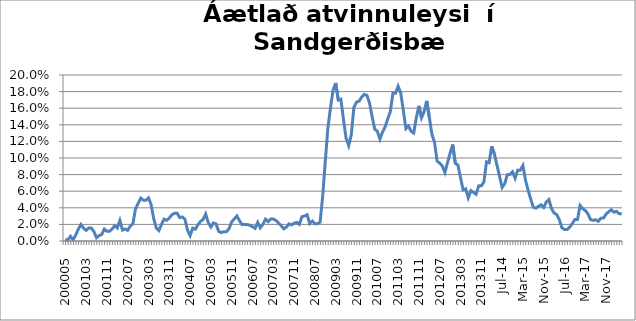
| Category | Series 0 |
|---|---|
| 200005 | 0.001 |
| 200006 | 0.001 |
| 200007 | 0.006 |
| 200010 | 0.001 |
| 200011 | 0.007 |
| 200012 | 0.014 |
| 200101 | 0.02 |
| 200102 | 0.016 |
| 200103 | 0.013 |
| 200104 | 0.016 |
| 200105 | 0.016 |
| 200106 | 0.011 |
| 200107 | 0.004 |
| 200108 | 0.007 |
| 200109 | 0.008 |
| 200110 | 0.014 |
| 200111 | 0.012 |
| 200112 | 0.012 |
| 200201 | 0.014 |
| 200202 | 0.018 |
| 200203 | 0.016 |
| 200204 | 0.025 |
| 200205 | 0.013 |
| 200206 | 0.014 |
| 200207 | 0.013 |
| 200208 | 0.018 |
| 200209 | 0.021 |
| 200210 | 0.039 |
| 200211 | 0.045 |
| 200212 | 0.052 |
| 200301 | 0.049 |
| 200302 | 0.049 |
| 200303 | 0.052 |
| 200304 | 0.044 |
| 200305 | 0.027 |
| 200306 | 0.015 |
| 200307 | 0.013 |
| 200308 | 0.02 |
| 200309 | 0.026 |
| 200310 | 0.025 |
| 200311 | 0.028 |
| 200312 | 0.032 |
| 200401 | 0.034 |
| 200402 | 0.034 |
| 200403 | 0.028 |
| 200404 | 0.029 |
| 200405 | 0.026 |
| 200406 | 0.013 |
| 200407 | 0.006 |
| 200408 | 0.015 |
| 200409 | 0.014 |
| 200410 | 0.02 |
| 200411 | 0.023 |
| 200412 | 0.026 |
| 200501 | 0.032 |
| 200502 | 0.022 |
| 200503 | 0.017 |
| 200504 | 0.022 |
| 200505 | 0.021 |
| 200506 | 0.012 |
| 200507 | 0.01 |
| 200508 | 0.011 |
| 200509 | 0.011 |
| 200510 | 0.015 |
| 200511 | 0.023 |
| 200512 | 0.027 |
| 200601 | 0.03 |
| 200602 | 0.024 |
| 200603 | 0.02 |
| 200604 | 0.02 |
| 200605 | 0.02 |
| 200606 | 0.019 |
| 200607 | 0.017 |
| 200608 | 0.015 |
| 200609 | 0.022 |
| 200610 | 0.016 |
| 200611 | 0.02 |
| 200612 | 0.026 |
| 200701 | 0.023 |
| 200702 | 0.027 |
| 200703 | 0.027 |
| 200704 | 0.025 |
| 200705 | 0.022 |
| 200706 | 0.019 |
| 200707 | 0.015 |
| 200708 | 0.017 |
| 200709 | 0.021 |
| 200710 | 0.019 |
| 200711 | 0.021 |
| 200712 | 0.022 |
| 200801 | 0.02 |
| 200802 | 0.029 |
| 200803 | 0.03 |
| 200804 | 0.032 |
| 200805 | 0.021 |
| 200806 | 0.024 |
| 200807 | 0.021 |
| 200808 | 0.021 |
| 200809 | 0.023 |
| 200810 | 0.054 |
| 200811 | 0.096 |
| 200812 | 0.136 |
| 200901 | 0.161 |
| 200902 | 0.182 |
| 200903 | 0.19 |
| 200904 | 0.17 |
| 200905 | 0.171 |
| 200906 | 0.146 |
| 200907 | 0.124 |
| 200908 | 0.115 |
| 200909 | 0.128 |
| 200910 | 0.161 |
| 200911 | 0.167 |
| 200912 | 0.168 |
| 201001 | 0.173 |
| 201002 | 0.177 |
| 201003 | 0.176 |
| 201004 | 0.166 |
| 201005 | 0.15 |
| 201006 | 0.135 |
| 201007 | 0.132 |
| 201008 | 0.123 |
| 201009 | 0.131 |
| 201010 | 0.138 |
| 201011 | 0.147 |
| 201012 | 0.156 |
| 201101 | 0.178 |
| 201102 | 0.178 |
| 201103 | 0.187 |
| 201104 | 0.179 |
| 201105 | 0.158 |
| 201106 | 0.136 |
| 201107 | 0.139 |
| 201108 | 0.132 |
| 201109 | 0.13 |
| 201110 | 0.148 |
| 201111 | 0.163 |
| 201112 | 0.148 |
| 201201 | 0.156 |
| 201202 | 0.169 |
| 201203 | 0.149 |
| 201204 | 0.129 |
| 201205 | 0.119 |
| 201206 | 0.096 |
| 201207 | 0.094 |
| 201208 | 0.09 |
| 201209 | 0.083 |
| 201210 | 0.094 |
| 201211 | 0.106 |
| 201212 | 0.116 |
| 201301 | 0.094 |
| 201302 | 0.091 |
| 201303 | 0.077 |
| 201304 | 0.062 |
| 201305 | 0.063 |
| 201306 | 0.052 |
| 201307 | 0.061 |
| 201308 | 0.058 |
| 201309 | 0.056 |
| 201310 | 0.067 |
| 201311 | 0.067 |
| 201312 | 0.071 |
| jan.14 | 0.095 |
| feb.14 | 0.094 |
| mar.14 | 0.114 |
| apr.14 | 0.105 |
| maí.14 | 0.092 |
| jún.14 | 0.078 |
| júl.14 | 0.065 |
| ágú.14 | 0.069 |
| sep.14 | 0.08 |
| okt.14 | 0.08 |
| nóv.14 | 0.083 |
| des.14 | 0.076 |
| jan.15 | 0.085 |
| feb.15 | 0.085 |
| mar.15 | 0.091 |
| apr.15 | 0.073 |
| maí.15 | 0.061 |
| jún.15 | 0.051 |
| júl.15 | 0.041 |
| ágú.15 | 0.04 |
| sep.15 | 0.042 |
| okt.15 | 0.044 |
| nóv.15 | 0.04 |
| des.15 | 0.047 |
| jan.16 | 0.05 |
| feb.16 | 0.039 |
| mar.16 | 0.034 |
| apr.16 | 0.032 |
| maí.16 | 0.026 |
| jún.16 | 0.016 |
| júl.16 | 0.014 |
| ágú.16 | 0.014 |
| sep.16 | 0.017 |
| okt.16 | 0.021 |
| nóv.16 | 0.026 |
| des.16 | 0.026 |
| jan.17 | 0.043 |
| feb.17 | 0.039 |
| mar.17 | 0.037 |
| apr.17 | 0.033 |
| maí.17 | 0.026 |
| jún.17 | 0.025 |
| júl.17 | 0.026 |
| ágú.17 | 0.024 |
| sep.17 | 0.028 |
| okt.17 | 0.028 |
| nóv.17 | 0.032 |
| des.17 | 0.035 |
| jan.18 | 0.038 |
| feb.18 | 0.035 |
| mar.18 | 0.036 |
| apr.18 | 0.033 |
| maí.18 | 0.033 |